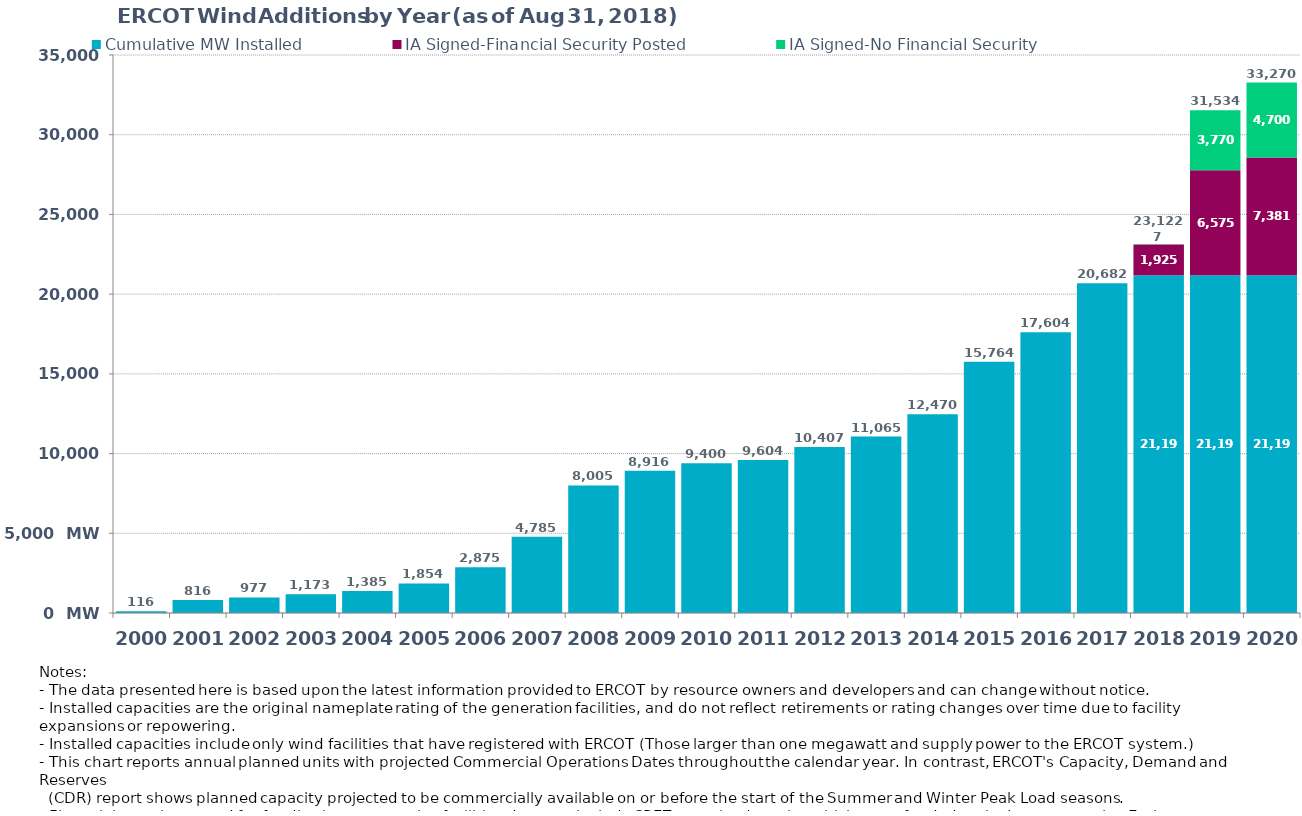
| Category | Cumulative MW Installed | IA Signed-Financial Security Posted  | IA Signed-No Financial Security  | Cumulative Installed and Planned |
|---|---|---|---|---|
| 2000.0 | 116 | 0 | 0 | 116 |
| 2001.0 | 816 | 0 | 0 | 816 |
| 2002.0 | 977 | 0 | 0 | 977 |
| 2003.0 | 1173 | 0 | 0 | 1173 |
| 2004.0 | 1385 | 0 | 0 | 1385 |
| 2005.0 | 1854 | 0 | 0 | 1854 |
| 2006.0 | 2875 | 0 | 0 | 2875 |
| 2007.0 | 4785 | 0 | 0 | 4785 |
| 2008.0 | 8005 | 0 | 0 | 8005 |
| 2009.0 | 8916 | 0 | 0 | 8916 |
| 2010.0 | 9400 | 0 | 0 | 9400 |
| 2011.0 | 9604 | 0 | 0 | 9604 |
| 2012.0 | 10407 | 0 | 0 | 10407 |
| 2013.0 | 11065 | 0 | 0 | 11065 |
| 2014.0 | 12470 | 0 | 0 | 12470 |
| 2015.0 | 15764 | 0 | 0 | 15764 |
| 2016.0 | 17604 | 0 | 0 | 17604 |
| 2017.0 | 20682 | 0 | 0 | 20682 |
| 2018.0 | 21190 | 1924.8 | 7.3 | 23122.1 |
| 2019.0 | 21190 | 6574.8 | 3769.5 | 31534.3 |
| 2020.0 | 21190 | 7380.6 | 4699.8 | 33270.4 |